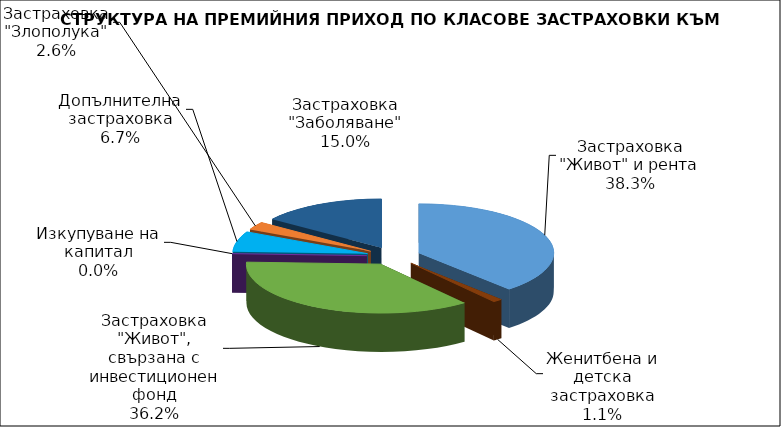
| Category | Застраховка "Живот" и рента |
|---|---|
| Застраховка "Живот" и рента | 93570502.394 |
| Женитбена и детска застраховка | 2766614.023 |
| Застраховка "Живот", свързана с инвестиционен фонд | 88347920.179 |
| Изкупуване на капитал | 0 |
| Допълнителна застраховка | 16395836.753 |
| Застраховка "Злополука" | 6403215.85 |
| Застраховка "Заболяване" | 36632284.46 |